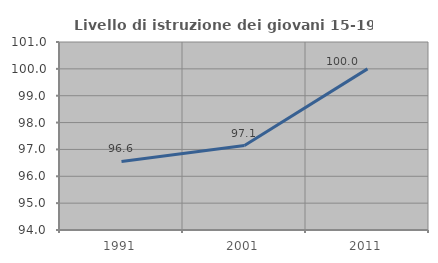
| Category | Livello di istruzione dei giovani 15-19 anni |
|---|---|
| 1991.0 | 96.552 |
| 2001.0 | 97.143 |
| 2011.0 | 100 |